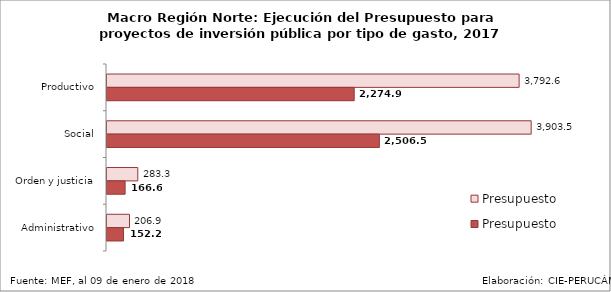
| Category | Presupuesto | Presupuesto Ejecutado |
|---|---|---|
| Productivo | 3792.557 | 2274.921 |
| Social | 3903.454 | 2506.547 |
| Orden y justicia | 283.266 | 166.593 |
| Administrativo | 206.947 | 152.187 |